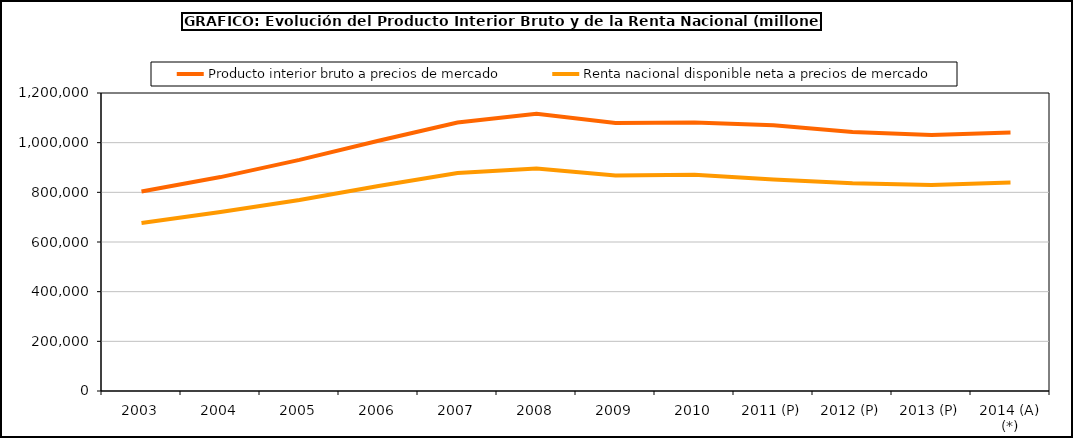
| Category | Producto interior bruto a precios de mercado | Renta nacional disponible neta a precios de mercado |
|---|---|---|
| 2003 | 803472 | 676423 |
| 2004 | 861420 | 720960 |
| 2005 | 930566 | 769191 |
| 2006 | 1007974 | 825243 |
| 2007 | 1080807 | 877626 |
| 2008 | 1116207 | 896297 |
| 2009 | 1079034 | 867973 |
| 2010 | 1080913 | 871015 |
| 2011 (P) | 1070413 | 851948 |
| 2012 (P) | 1042872 | 836933 |
| 2013 (P) | 1031272 | 829954 |
| 2014 (A) (*) | 1041160 | 839636 |